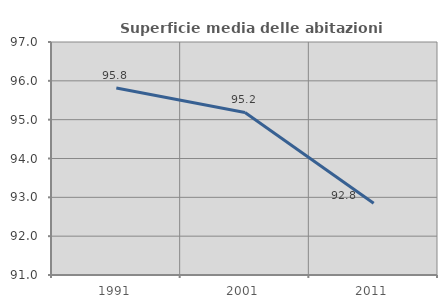
| Category | Superficie media delle abitazioni occupate |
|---|---|
| 1991.0 | 95.817 |
| 2001.0 | 95.187 |
| 2011.0 | 92.846 |